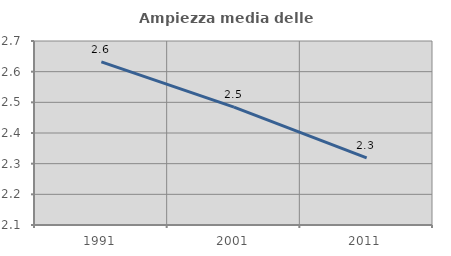
| Category | Ampiezza media delle famiglie |
|---|---|
| 1991.0 | 2.632 |
| 2001.0 | 2.485 |
| 2011.0 | 2.319 |